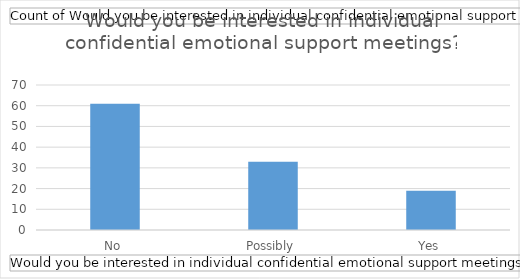
| Category | Total |
|---|---|
| No | 61 |
| Possibly | 33 |
| Yes | 19 |